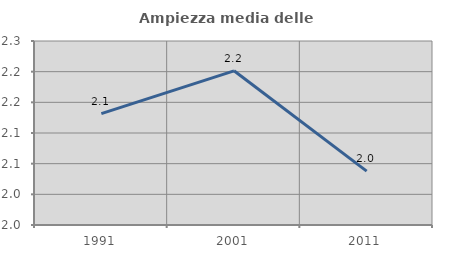
| Category | Ampiezza media delle famiglie |
|---|---|
| 1991.0 | 2.131 |
| 2001.0 | 2.201 |
| 2011.0 | 2.038 |